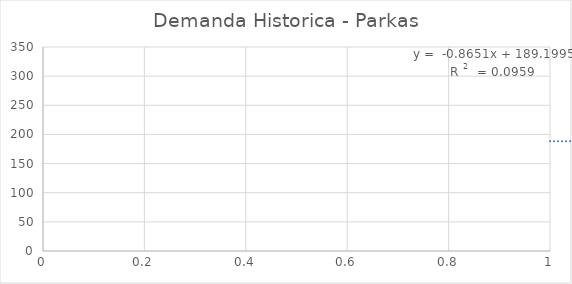
| Category | Series 0 |
|---|---|
| 0 | 78 |
| 1 | 185 |
| 2 | 123 |
| 3 | 215 |
| 4 | 107 |
| 5 | 188 |
| 6 | 253 |
| 7 | 176 |
| 8 | 146 |
| 9 | 138 |
| 10 | 183 |
| 11 | 246 |
| 12 | 87 |
| 13 | 158 |
| 14 | 204 |
| 15 | 259 |
| 16 | 87 |
| 17 | 141 |
| 18 | 229 |
| 19 | 250 |
| 20 | 241 |
| 21 | 300 |
| 22 | 253 |
| 23 | 268 |
| 24 | 160 |
| 25 | 148 |
| 26 | 121 |
| 27 | 158 |
| 28 | 107 |
| 29 | 126 |
| 30 | 132 |
| 31 | 130 |
| 32 | 108 |
| 33 | 120 |
| 34 | 139 |
| 35 | 105 |
| 36 | 100 |
| 37 | 176 |
| 38 | 183 |
| 39 | 219 |
| 40 | 133 |
| 41 | 106 |
| 42 | 166 |
| 43 | 247 |
| 44 | 202 |
| 45 | 227 |
| 46 | 252 |
| 47 | 256 |
| 48 | 118 |
| 49 | 71 |
| 50 | 143 |
| 51 | 125 |
| 52 | 152 |
| 53 | 174 |
| 54 | 183 |
| 55 | 220 |
| 56 | 94 |
| 57 | 75 |
| 58 | 121 |
| 59 | 227 |
| 60 | 85 |
| 61 | 105 |
| 62 | 144 |
| 63 | 142 |
| 64 | 69 |
| 65 | 122 |
| 66 | 103 |
| 67 | 104 |
| 68 | 118 |
| 69 | 96 |
| 70 | 131 |
| 71 | 91 |